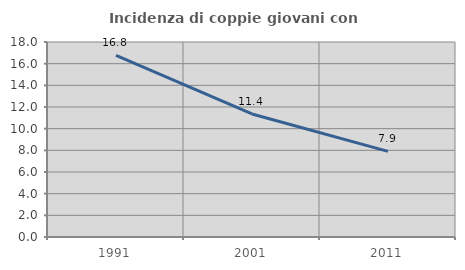
| Category | Incidenza di coppie giovani con figli |
|---|---|
| 1991.0 | 16.76 |
| 2001.0 | 11.359 |
| 2011.0 | 7.9 |